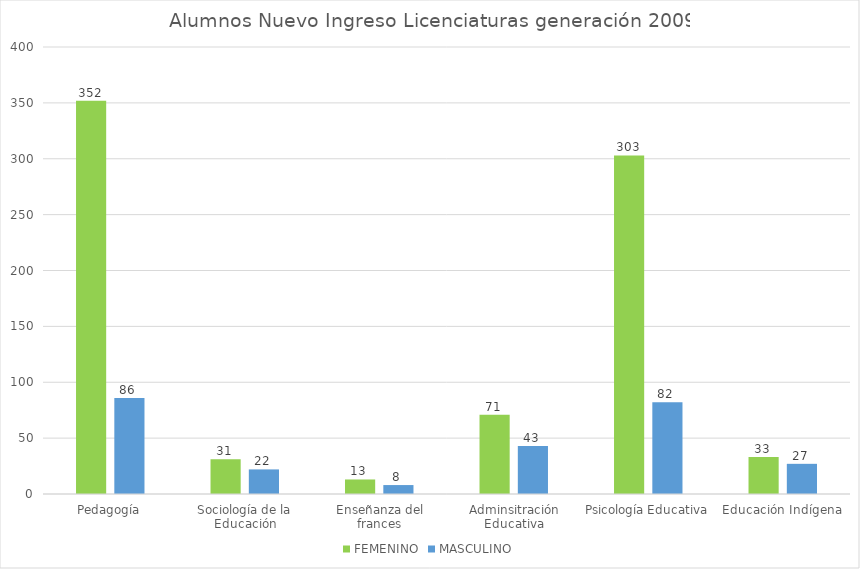
| Category | FEMENINO | MASCULINO |
|---|---|---|
| Pedagogía | 352 | 86 |
| Sociología de la Educación | 31 | 22 |
| Enseñanza del frances | 13 | 8 |
| Adminsitración Educativa | 71 | 43 |
| Psicología Educativa | 303 | 82 |
| Educación Indígena | 33 | 27 |